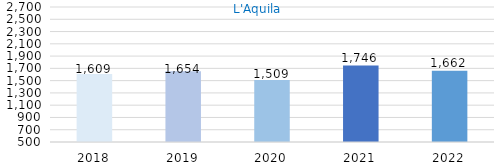
| Category | Series 0 |
|---|---|
| 2018.0 | 1609 |
| 2019.0 | 1654 |
| 2020.0 | 1509 |
| 2021.0 | 1746 |
| 2022.0 | 1662 |